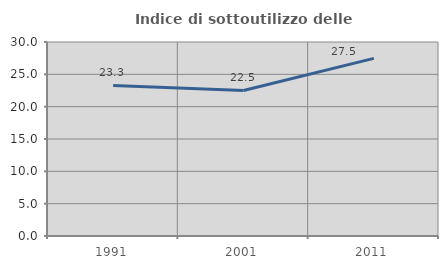
| Category | Indice di sottoutilizzo delle abitazioni  |
|---|---|
| 1991.0 | 23.278 |
| 2001.0 | 22.51 |
| 2011.0 | 27.469 |